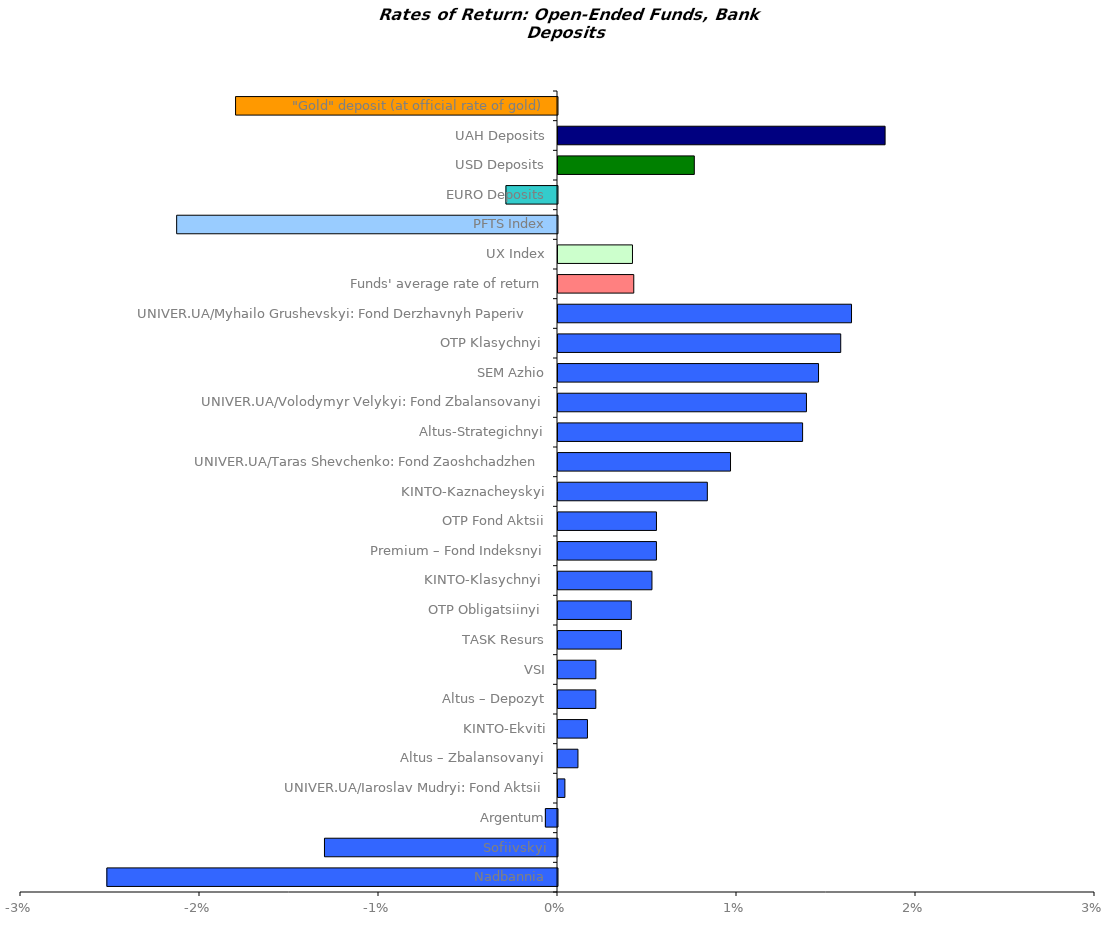
| Category | Series 0 |
|---|---|
| Nadbannia | -0.025 |
| Sofiivskyi | -0.013 |
| Argentum | -0.001 |
| UNIVER.UA/Iaroslav Mudryi: Fond Aktsii | 0 |
| Altus – Zbalansovanyi | 0.001 |
| KINTO-Ekviti | 0.002 |
| Altus – Depozyt | 0.002 |
| VSI | 0.002 |
| TASK Resurs | 0.004 |
| OTP Obligatsiinyi  | 0.004 |
| KINTO-Klasychnyi  | 0.005 |
| Premium – Fond Indeksnyi | 0.005 |
| OTP Fond Aktsii | 0.006 |
| KINTO-Kaznacheyskyi | 0.008 |
| UNIVER.UA/Taras Shevchenko: Fond Zaoshchadzhen | 0.01 |
| Altus-Strategichnyi | 0.014 |
| UNIVER.UA/Volodymyr Velykyi: Fond Zbalansovanyi | 0.014 |
| SEM Azhio | 0.015 |
| OTP Klasychnyi  | 0.016 |
| UNIVER.UA/Myhailo Grushevskyi: Fond Derzhavnyh Paperiv    | 0.016 |
| Funds' average rate of return | 0.004 |
| UX Index | 0.004 |
| PFTS Index | -0.021 |
| EURO Deposits | -0.003 |
| USD Deposits | 0.008 |
| UAH Deposits | 0.018 |
| "Gold" deposit (at official rate of gold) | -0.018 |